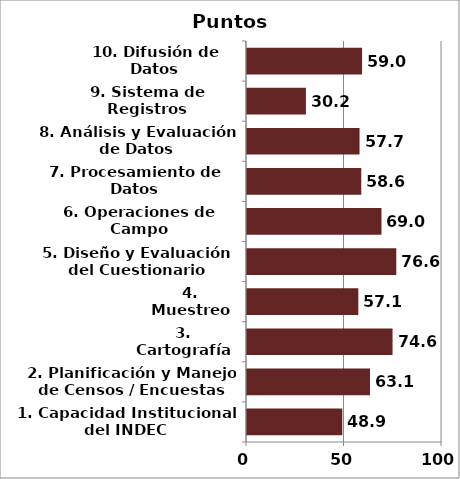
| Category | Series 0 |
|---|---|
| 1. Capacidad Institucional del INDEC | 48.868 |
| 2. Planificación y Manejo de Censos / Encuestas | 63.071 |
| 3. Cartografía | 74.638 |
| 4. Muestreo | 57.083 |
| 5. Diseño y Evaluación del Cuestionario | 76.564 |
| 6. Operaciones de Campo | 68.964 |
| 7. Procesamiento de Datos | 58.593 |
| 8. Análisis y Evaluación de Datos | 57.71 |
| 9. Sistema de Registros Administrativos | 30.208 |
| 10. Difusión de Datos | 59.005 |